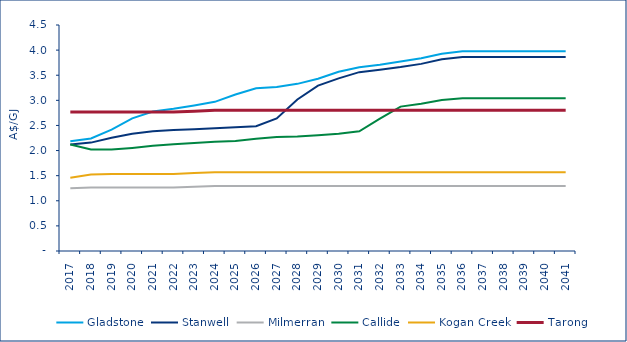
| Category | Gladstone | Stanwell | Milmerran | Callide | Kogan Creek | Tarong |
|---|---|---|---|---|---|---|
| 2017.0 | 2.184 | 2.121 | 1.249 | 2.12 | 1.459 | 2.766 |
| 2018.0 | 2.24 | 2.158 | 1.265 | 2.02 | 1.521 | 2.766 |
| 2019.0 | 2.415 | 2.254 | 1.265 | 2.02 | 1.535 | 2.766 |
| 2020.0 | 2.641 | 2.335 | 1.265 | 2.053 | 1.535 | 2.766 |
| 2021.0 | 2.777 | 2.386 | 1.265 | 2.095 | 1.535 | 2.766 |
| 2022.0 | 2.833 | 2.408 | 1.265 | 2.127 | 1.535 | 2.766 |
| 2023.0 | 2.899 | 2.425 | 1.278 | 2.149 | 1.551 | 2.784 |
| 2024.0 | 2.97 | 2.444 | 1.292 | 2.173 | 1.567 | 2.803 |
| 2025.0 | 3.117 | 2.462 | 1.292 | 2.191 | 1.567 | 2.803 |
| 2026.0 | 3.239 | 2.485 | 1.292 | 2.234 | 1.567 | 2.803 |
| 2027.0 | 3.265 | 2.64 | 1.292 | 2.269 | 1.567 | 2.803 |
| 2028.0 | 3.328 | 3.017 | 1.292 | 2.278 | 1.567 | 2.803 |
| 2029.0 | 3.429 | 3.293 | 1.292 | 2.304 | 1.567 | 2.803 |
| 2030.0 | 3.569 | 3.438 | 1.292 | 2.337 | 1.567 | 2.803 |
| 2031.0 | 3.658 | 3.561 | 1.292 | 2.384 | 1.567 | 2.803 |
| 2032.0 | 3.709 | 3.611 | 1.292 | 2.635 | 1.567 | 2.803 |
| 2033.0 | 3.772 | 3.662 | 1.292 | 2.875 | 1.567 | 2.803 |
| 2034.0 | 3.837 | 3.726 | 1.292 | 2.934 | 1.567 | 2.803 |
| 2035.0 | 3.929 | 3.816 | 1.292 | 3.005 | 1.567 | 2.803 |
| 2036.0 | 3.976 | 3.861 | 1.292 | 3.04 | 1.567 | 2.803 |
| 2037.0 | 3.976 | 3.861 | 1.292 | 3.04 | 1.567 | 2.803 |
| 2038.0 | 3.976 | 3.861 | 1.292 | 3.04 | 1.567 | 2.803 |
| 2039.0 | 3.976 | 3.861 | 1.292 | 3.04 | 1.567 | 2.803 |
| 2040.0 | 3.976 | 3.861 | 1.292 | 3.04 | 1.567 | 2.803 |
| 2041.0 | 3.976 | 3.861 | 1.292 | 3.04 | 1.567 | 2.803 |